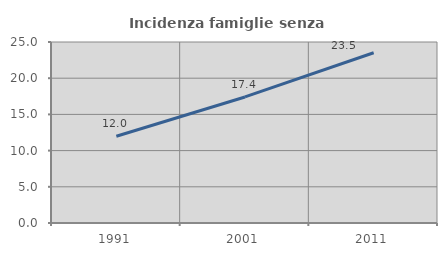
| Category | Incidenza famiglie senza nuclei |
|---|---|
| 1991.0 | 11.986 |
| 2001.0 | 17.41 |
| 2011.0 | 23.517 |